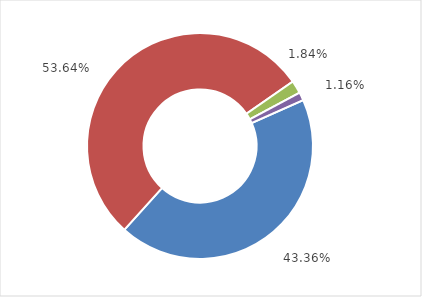
| Category | Series 0 |
|---|---|
| ATM | 10661539496 |
| EFTPOS terminal | 13190148711 |
| Internet | 452950761 |
| EFTPOS terminal for withdrawal and deposit | 284014348 |